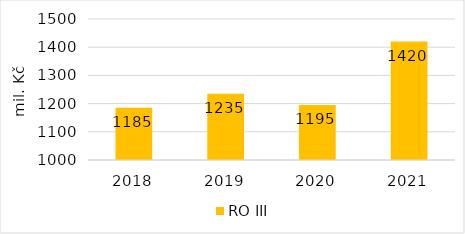
| Category | RO III |
|---|---|
| 2018.0 | 1185 |
| 2019.0 | 1235 |
| 2020.0 | 1195 |
| 2021.0 | 1420 |